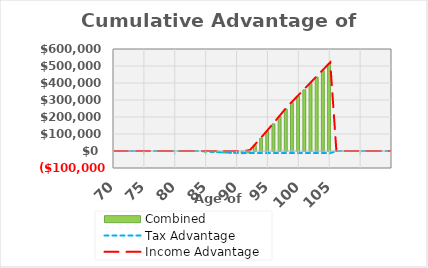
| Category |  Combined |
|---|---|
| 70 | 0 |
| 71 | 0 |
| 72 | 0 |
| 73 | 0 |
| 74 | 0 |
| 75 | 0 |
| 76 | 0 |
| 77 | 0 |
| 78 | 0 |
| 79 | 0 |
| 80 | 0 |
| 81 | 0 |
| 82 | 0 |
| 83 | 0 |
| 84 | 0 |
| 85 | -2417.533 |
| 86 | -4618.899 |
| 87 | -6600.243 |
| 88 | -8357.56 |
| 89 | -9885.732 |
| 90 | -11178.8 |
| 91 | -12231.795 |
| 92 | -7015.016 |
| 93 | 33306.057 |
| 94 | 74473.872 |
| 95 | 116506.211 |
| 96 | 159421.23 |
| 97 | 203237.463 |
| 98 | 246985.956 |
| 99 | 284485.956 |
| 100 | 321985.956 |
| 101 | 359485.956 |
| 102 | 396985.956 |
| 103 | 434485.956 |
| 104 | 471985.956 |
| 105 | 509485.956 |